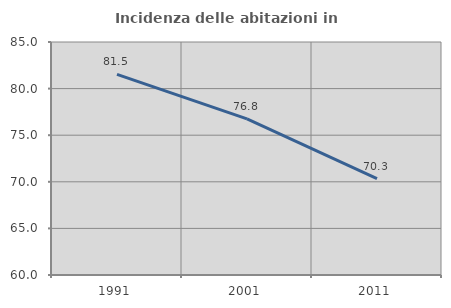
| Category | Incidenza delle abitazioni in proprietà  |
|---|---|
| 1991.0 | 81.525 |
| 2001.0 | 76.757 |
| 2011.0 | 70.332 |